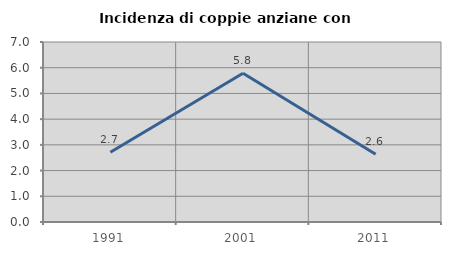
| Category | Incidenza di coppie anziane con figli |
|---|---|
| 1991.0 | 2.713 |
| 2001.0 | 5.785 |
| 2011.0 | 2.632 |